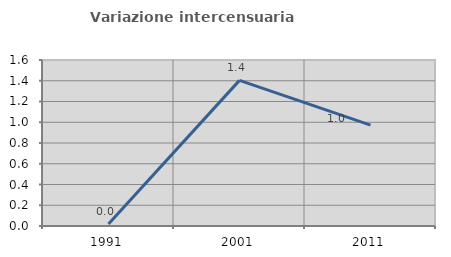
| Category | Variazione intercensuaria annua |
|---|---|
| 1991.0 | 0.019 |
| 2001.0 | 1.404 |
| 2011.0 | 0.972 |